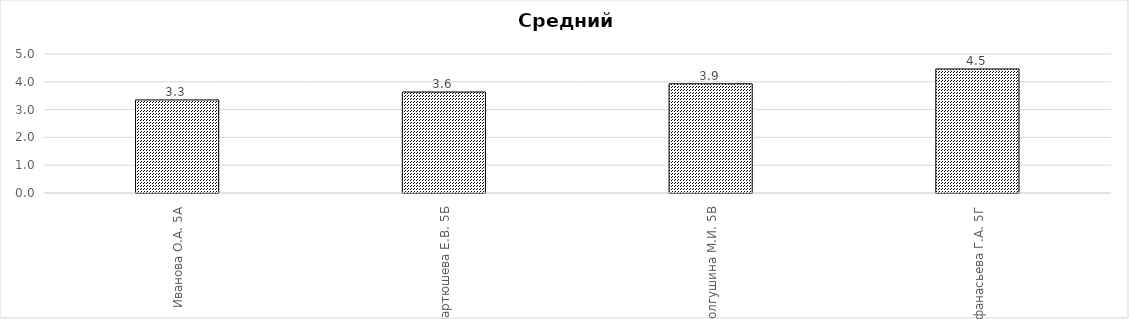
| Category | Средний балл |
|---|---|
| Иванова О.А. 5А | 3.348 |
| Мартюшева Е.В. 5Б | 3.633 |
| Долгушина М.И. 5В | 3.929 |
| Афанасьева Г.А. 5Г | 4.462 |